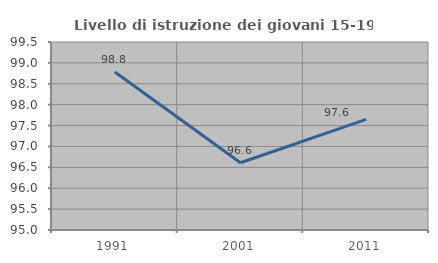
| Category | Livello di istruzione dei giovani 15-19 anni |
|---|---|
| 1991.0 | 98.78 |
| 2001.0 | 96.61 |
| 2011.0 | 97.647 |